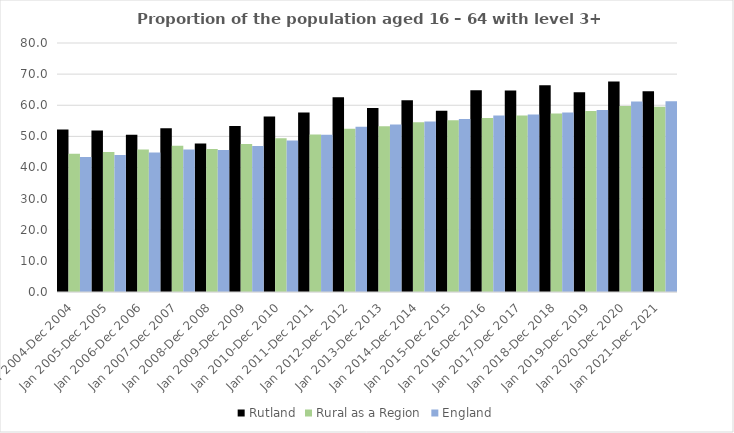
| Category | Rutland | Rural as a Region | England |
|---|---|---|---|
| Jan 2004-Dec 2004 | 52.2 | 44.405 | 43.4 |
| Jan 2005-Dec 2005 | 51.9 | 44.973 | 44 |
| Jan 2006-Dec 2006 | 50.5 | 45.774 | 44.8 |
| Jan 2007-Dec 2007 | 52.6 | 46.968 | 45.8 |
| Jan 2008-Dec 2008 | 47.7 | 45.964 | 45.6 |
| Jan 2009-Dec 2009 | 53.3 | 47.59 | 46.9 |
| Jan 2010-Dec 2010 | 56.4 | 49.362 | 48.7 |
| Jan 2011-Dec 2011 | 57.7 | 50.602 | 50.5 |
| Jan 2012-Dec 2012 | 62.6 | 52.439 | 53.1 |
| Jan 2013-Dec 2013 | 59.1 | 53.276 | 53.8 |
| Jan 2014-Dec 2014 | 61.6 | 54.57 | 54.8 |
| Jan 2015-Dec 2015 | 58.2 | 55.16 | 55.6 |
| Jan 2016-Dec 2016 | 64.8 | 55.941 | 56.7 |
| Jan 2017-Dec 2017 | 64.7 | 56.689 | 57 |
| Jan 2018-Dec 2018 | 66.4 | 57.389 | 57.7 |
| Jan 2019-Dec 2019 | 64.2 | 58.147 | 58.5 |
| Jan 2020-Dec 2020 | 67.6 | 59.771 | 61.2 |
| Jan 2021-Dec 2021 | 64.5 | 59.54 | 61.3 |